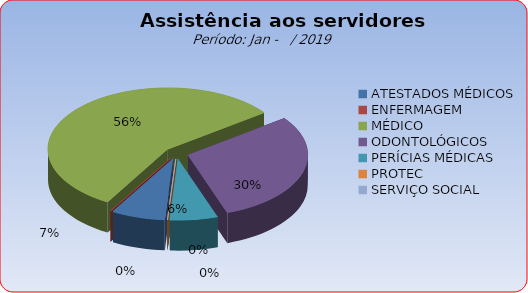
| Category | Series 0 |
|---|---|
| ATESTADOS MÉDICOS | 7.258 |
| ENFERMAGEM | 0 |
| MÉDICO | 56.452 |
| ODONTOLÓGICOS | 29.839 |
| PERÍCIAS MÉDICAS | 6.452 |
| PROTEC | 0 |
| SERVIÇO SOCIAL | 0 |